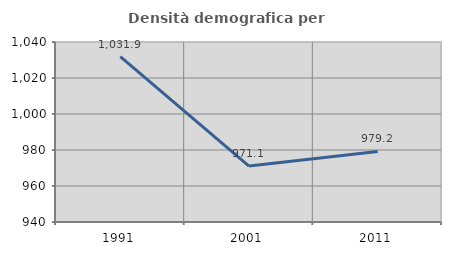
| Category | Densità demografica |
|---|---|
| 1991.0 | 1031.861 |
| 2001.0 | 971.091 |
| 2011.0 | 979.21 |